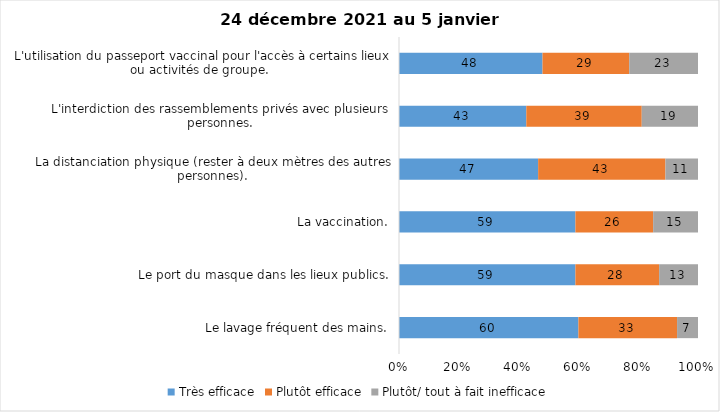
| Category | Très efficace | Plutôt efficace | Plutôt/ tout à fait inefficace |
|---|---|---|---|
| Le lavage fréquent des mains. | 60 | 33 | 7 |
| Le port du masque dans les lieux publics. | 59 | 28 | 13 |
| La vaccination. | 59 | 26 | 15 |
| La distanciation physique (rester à deux mètres des autres personnes). | 47 | 43 | 11 |
| L'interdiction des rassemblements privés avec plusieurs personnes. | 43 | 39 | 19 |
| L'utilisation du passeport vaccinal pour l'accès à certains lieux ou activités de groupe.  | 48 | 29 | 23 |